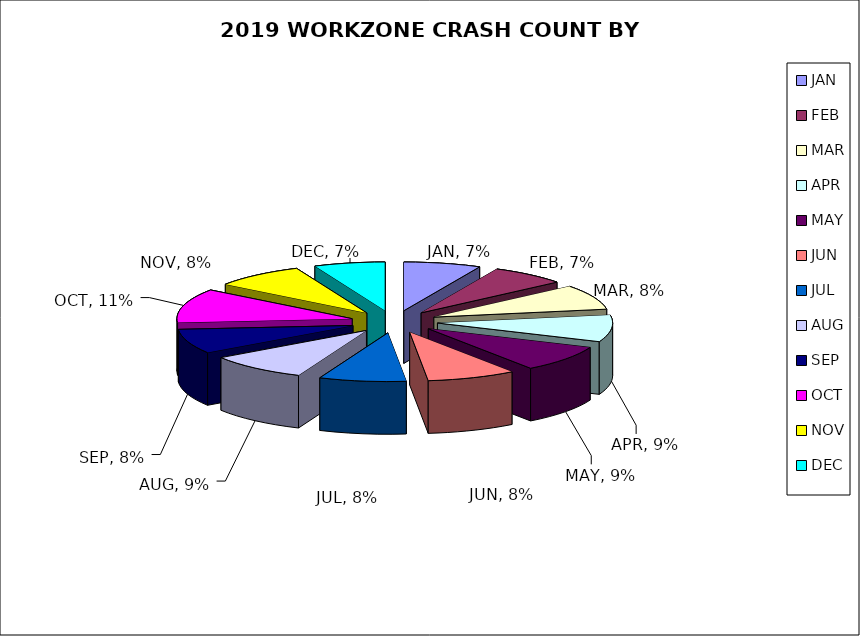
| Category | Month |
|---|---|
| JAN | 0.071 |
| FEB | 0.07 |
| MAR | 0.083 |
| APR | 0.089 |
| MAY | 0.088 |
| JUN | 0.082 |
| JUL | 0.08 |
| AUG | 0.092 |
| SEP | 0.081 |
| OCT | 0.113 |
| NOV | 0.084 |
| DEC | 0.066 |